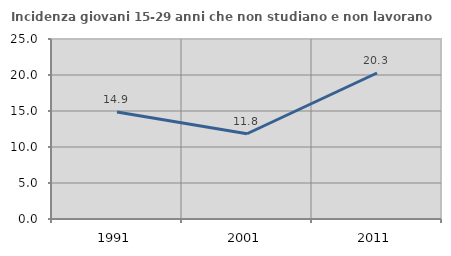
| Category | Incidenza giovani 15-29 anni che non studiano e non lavorano  |
|---|---|
| 1991.0 | 14.851 |
| 2001.0 | 11.842 |
| 2011.0 | 20.28 |